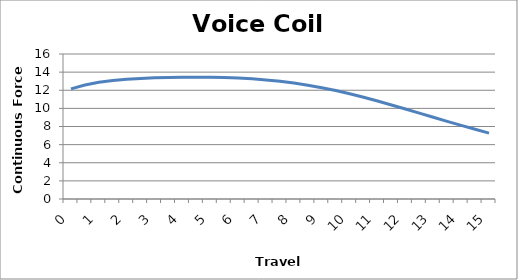
| Category | Series 0 |
|---|---|
| 0.0 | 12.155 |
| 0.5 | 12.582 |
| 1.0 | 12.877 |
| 1.5 | 13.078 |
| 2.0 | 13.213 |
| 2.5 | 13.305 |
| 3.0 | 13.366 |
| 3.5 | 13.406 |
| 4.0 | 13.429 |
| 4.5 | 13.436 |
| 5.0 | 13.427 |
| 5.5 | 13.397 |
| 6.0 | 13.342 |
| 6.5 | 13.259 |
| 7.0 | 13.142 |
| 7.5 | 12.989 |
| 8.0 | 12.795 |
| 8.5 | 12.56 |
| 9.0 | 12.284 |
| 9.5 | 11.968 |
| 10.0 | 11.614 |
| 10.5 | 11.228 |
| 11.0 | 10.814 |
| 11.5 | 10.379 |
| 12.0 | 9.93 |
| 12.5 | 9.474 |
| 13.0 | 9.018 |
| 13.5 | 8.567 |
| 14.0 | 8.126 |
| 14.5 | 7.696 |
| 15.0 | 7.274 |